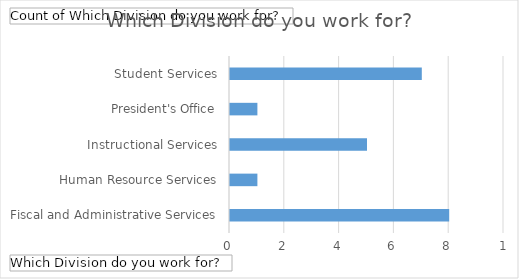
| Category | Total |
|---|---|
| Fiscal and Administrative Services | 8 |
| Human Resource Services | 1 |
| Instructional Services | 5 |
| President's Office | 1 |
| Student Services | 7 |